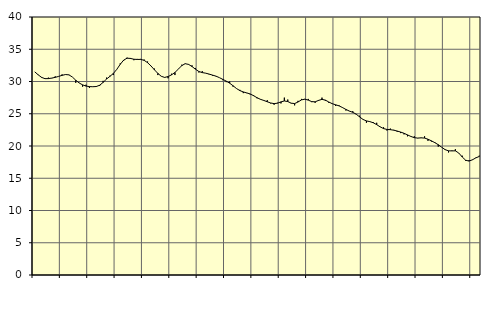
| Category | Piggar | Series 1 |
|---|---|---|
| nan | 31.5 | 31.5 |
| 87.0 | 31 | 31.04 |
| 87.0 | 30.7 | 30.64 |
| 87.0 | 30.4 | 30.44 |
| nan | 30.6 | 30.45 |
| 88.0 | 30.5 | 30.53 |
| 88.0 | 30.8 | 30.64 |
| 88.0 | 30.8 | 30.79 |
| nan | 31.1 | 30.95 |
| 89.0 | 31.1 | 31.08 |
| 89.0 | 31 | 31.03 |
| 89.0 | 30.7 | 30.7 |
| nan | 29.8 | 30.2 |
| 90.0 | 29.8 | 29.77 |
| 90.0 | 29.2 | 29.48 |
| 90.0 | 29.5 | 29.29 |
| nan | 29 | 29.21 |
| 91.0 | 29.2 | 29.19 |
| 91.0 | 29.3 | 29.22 |
| 91.0 | 29.3 | 29.42 |
| nan | 30.1 | 29.86 |
| 92.0 | 30.6 | 30.38 |
| 92.0 | 30.9 | 30.8 |
| 92.0 | 31 | 31.25 |
| nan | 31.9 | 31.88 |
| 93.0 | 32.8 | 32.66 |
| 93.0 | 33.2 | 33.31 |
| 93.0 | 33.7 | 33.61 |
| nan | 33.5 | 33.58 |
| 94.0 | 33.3 | 33.45 |
| 94.0 | 33.5 | 33.42 |
| 94.0 | 33.5 | 33.43 |
| nan | 33.4 | 33.28 |
| 95.0 | 33.1 | 32.92 |
| 95.0 | 32.4 | 32.41 |
| 95.0 | 32 | 31.82 |
| nan | 31 | 31.26 |
| 96.0 | 30.8 | 30.81 |
| 96.0 | 30.6 | 30.63 |
| 96.0 | 30.5 | 30.77 |
| nan | 31.2 | 31.03 |
| 97.0 | 31 | 31.4 |
| 97.0 | 31.9 | 31.92 |
| 97.0 | 32.6 | 32.46 |
| nan | 32.8 | 32.76 |
| 98.0 | 32.6 | 32.65 |
| 98.0 | 32.5 | 32.32 |
| 98.0 | 32.1 | 31.91 |
| nan | 31.4 | 31.55 |
| 99.0 | 31.6 | 31.38 |
| 99.0 | 31.3 | 31.29 |
| 99.0 | 31.1 | 31.15 |
| nan | 30.9 | 30.99 |
| 0.0 | 30.8 | 30.83 |
| 0.0 | 30.6 | 30.6 |
| 0.0 | 30.2 | 30.33 |
| nan | 29.9 | 30.06 |
| 1.0 | 30 | 29.74 |
| 1.0 | 29.2 | 29.34 |
| 1.0 | 28.9 | 28.91 |
| nan | 28.7 | 28.59 |
| 2.0 | 28.2 | 28.38 |
| 2.0 | 28.2 | 28.23 |
| 2.0 | 28 | 28.07 |
| nan | 27.9 | 27.8 |
| 3.0 | 27.4 | 27.49 |
| 3.0 | 27.2 | 27.24 |
| 3.0 | 27.1 | 27.06 |
| nan | 27.1 | 26.86 |
| 4.0 | 26.6 | 26.67 |
| 4.0 | 26.4 | 26.57 |
| 4.0 | 26.7 | 26.64 |
| nan | 26.6 | 26.84 |
| 5.0 | 27.5 | 26.98 |
| 5.0 | 27.2 | 26.89 |
| 5.0 | 26.6 | 26.64 |
| nan | 26.3 | 26.58 |
| 6.0 | 27 | 26.82 |
| 6.0 | 27.3 | 27.15 |
| 6.0 | 27.3 | 27.26 |
| nan | 27.3 | 27.11 |
| 7.0 | 26.8 | 26.88 |
| 7.0 | 26.7 | 26.85 |
| 7.0 | 27 | 27.07 |
| nan | 27.5 | 27.23 |
| 8.0 | 27 | 27.11 |
| 8.0 | 26.7 | 26.82 |
| 8.0 | 26.6 | 26.56 |
| nan | 26.2 | 26.39 |
| 9.0 | 26.3 | 26.22 |
| 9.0 | 26 | 25.96 |
| 9.0 | 25.5 | 25.67 |
| nan | 25.4 | 25.42 |
| 10.0 | 25.4 | 25.22 |
| 10.0 | 24.9 | 24.94 |
| 10.0 | 24.7 | 24.51 |
| nan | 24.1 | 24.12 |
| 11.0 | 23.6 | 23.89 |
| 11.0 | 23.8 | 23.78 |
| 11.0 | 23.7 | 23.6 |
| nan | 23.6 | 23.31 |
| 12.0 | 23 | 22.97 |
| 12.0 | 22.9 | 22.7 |
| 12.0 | 22.4 | 22.57 |
| nan | 22.7 | 22.53 |
| 13.0 | 22.5 | 22.45 |
| 13.0 | 22.2 | 22.32 |
| 13.0 | 22 | 22.16 |
| nan | 21.8 | 21.97 |
| 14.0 | 21.5 | 21.72 |
| 14.0 | 21.5 | 21.48 |
| 14.0 | 21.5 | 21.29 |
| nan | 21.2 | 21.23 |
| 15.0 | 21.3 | 21.26 |
| 15.0 | 21.5 | 21.23 |
| 15.0 | 20.8 | 21.05 |
| nan | 20.7 | 20.8 |
| 16.0 | 20.6 | 20.52 |
| 16.0 | 19.9 | 20.2 |
| 16.0 | 19.8 | 19.81 |
| nan | 19.5 | 19.44 |
| 17.0 | 19 | 19.25 |
| 17.0 | 19.3 | 19.24 |
| 17.0 | 19.5 | 19.25 |
| nan | 18.9 | 18.91 |
| 18.0 | 18.5 | 18.3 |
| 18.0 | 17.7 | 17.8 |
| 18.0 | 17.8 | 17.66 |
| nan | 17.9 | 17.86 |
| 19.0 | 18.2 | 18.16 |
| 19.0 | 18.5 | 18.38 |